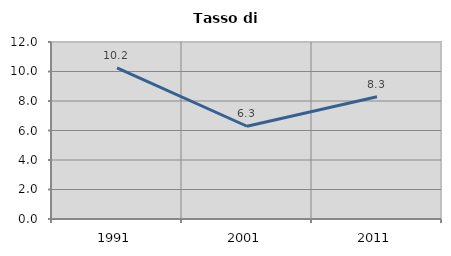
| Category | Tasso di disoccupazione   |
|---|---|
| 1991.0 | 10.248 |
| 2001.0 | 6.288 |
| 2011.0 | 8.292 |